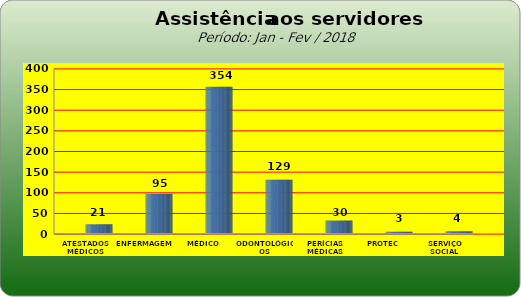
| Category | Series 0 |
|---|---|
| ATESTADOS MÉDICOS | 21 |
| ENFERMAGEM | 95 |
| MÉDICO | 354 |
| ODONTOLÓGICOS | 129 |
| PERÍCIAS MÉDICAS | 30 |
| PROTEC | 3 |
| SERVIÇO SOCIAL | 4 |